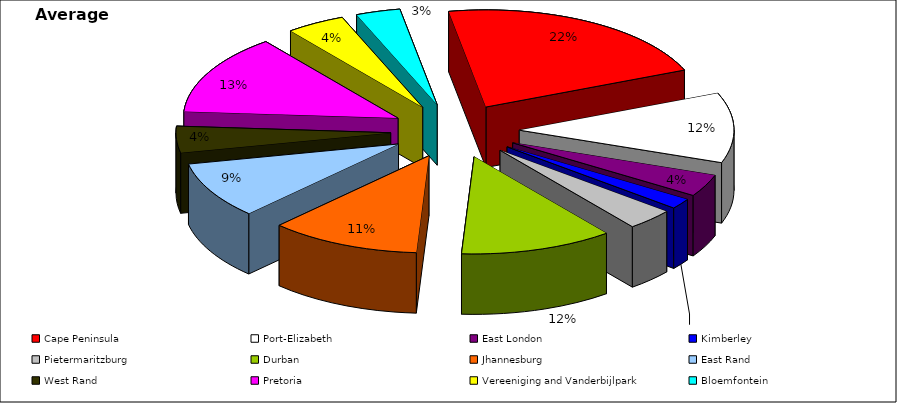
| Category | Average 2000 |
|---|---|
| Cape Peninsula | 18040.083 |
| Port-Elizabeth | 9746.917 |
| East London | 3081.583 |
| Kimberley | 1456.167 |
| Pietermaritzburg | 2991.417 |
| Durban | 9630.167 |
| Jhannesburg | 9499.083 |
| East Rand | 7862.25 |
| West Rand | 3690 |
| Pretoria | 11169.25 |
| Vereeniging and Vanderbijlpark | 3712.083 |
| Bloemfontein | 2798.417 |